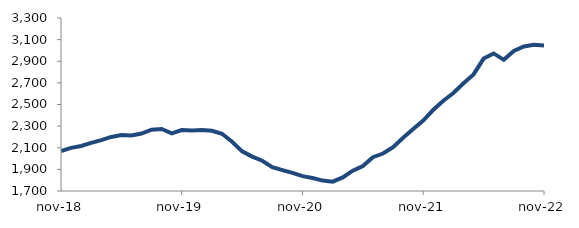
| Category | Series 0 |
|---|---|
| 2018-11-01 | 2068.002 |
| 2018-12-01 | 2098.706 |
| 2019-01-01 | 2116.727 |
| 2019-02-01 | 2144.876 |
| 2019-03-01 | 2171.077 |
| 2019-04-01 | 2199.941 |
| 2019-05-01 | 2218.125 |
| 2019-06-01 | 2213.708 |
| 2019-07-01 | 2231.834 |
| 2019-08-01 | 2267.321 |
| 2019-09-01 | 2273.768 |
| 2019-10-01 | 2233.304 |
| 2019-11-01 | 2263.898 |
| 2019-12-01 | 2259.926 |
| 2020-01-01 | 2265.053 |
| 2020-02-01 | 2256.766 |
| 2020-03-01 | 2229.161 |
| 2020-04-01 | 2155.791 |
| 2020-05-01 | 2066.843 |
| 2020-06-01 | 2018.026 |
| 2020-07-01 | 1979.558 |
| 2020-08-01 | 1920.368 |
| 2020-09-01 | 1893.237 |
| 2020-10-01 | 1867.4 |
| 2020-11-01 | 1837.195 |
| 2020-12-01 | 1819.546 |
| 2021-01-01 | 1796.45 |
| 2021-02-01 | 1786.603 |
| 2021-03-01 | 1826.072 |
| 2021-04-01 | 1887.798 |
| 2021-05-01 | 1930.372 |
| 2021-06-01 | 2012.926 |
| 2021-07-01 | 2046.434 |
| 2021-08-01 | 2105.806 |
| 2021-09-01 | 2192.514 |
| 2021-10-01 | 2272.972 |
| 2021-11-01 | 2351.334 |
| 2021-12-01 | 2451.171 |
| 2022-01-01 | 2534.613 |
| 2022-02-01 | 2606.357 |
| 2022-03-01 | 2696.948 |
| 2022-04-01 | 2778.264 |
| 2022-05-01 | 2924.682 |
| 2022-06-01 | 2972.281 |
| 2022-07-01 | 2912.933 |
| 2022-08-01 | 2994.913 |
| 2022-09-01 | 3036.467 |
| 2022-10-01 | 3052.236 |
| 2022-11-01 | 3044.767 |